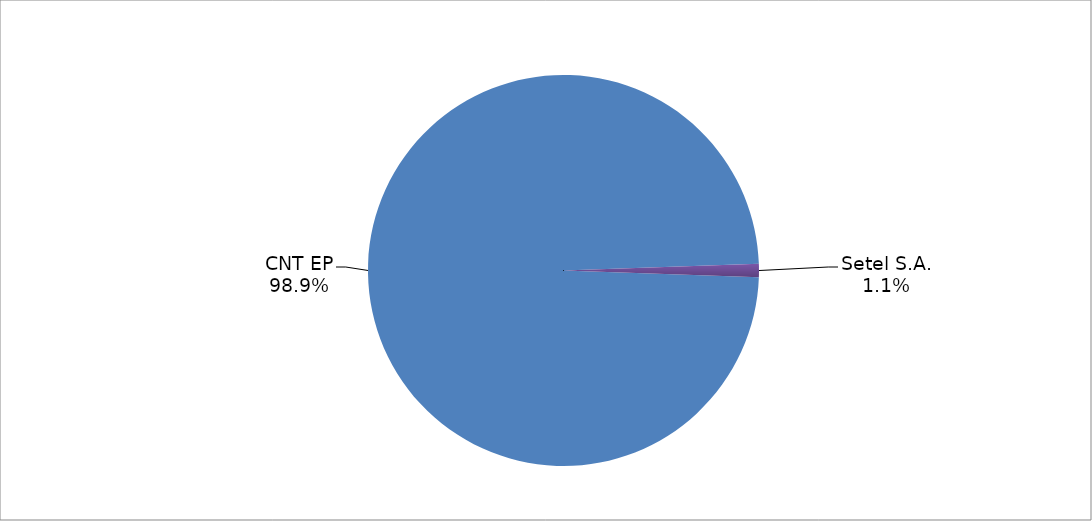
| Category | Series 0 |
|---|---|
| CNT EP | 268 |
| Setel S.A. | 3 |